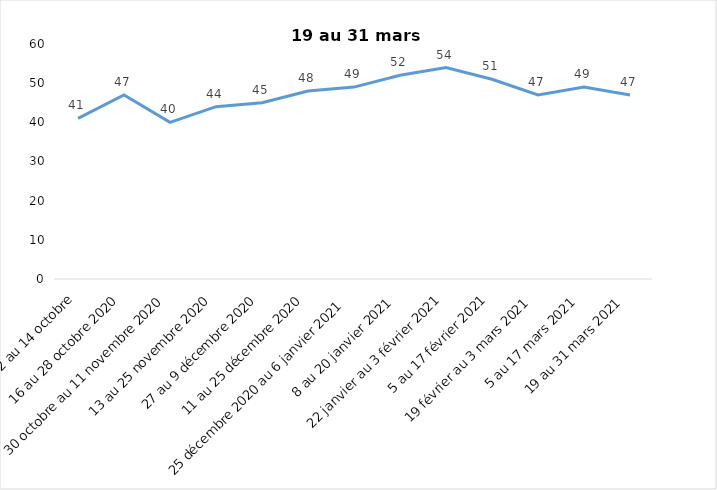
| Category | Toujours aux trois mesures |
|---|---|
| 2 au 14 octobre | 41 |
| 16 au 28 octobre 2020 | 47 |
| 30 octobre au 11 novembre 2020 | 40 |
| 13 au 25 novembre 2020 | 44 |
| 27 au 9 décembre 2020 | 45 |
| 11 au 25 décembre 2020 | 48 |
| 25 décembre 2020 au 6 janvier 2021 | 49 |
| 8 au 20 janvier 2021 | 52 |
| 22 janvier au 3 février 2021 | 54 |
| 5 au 17 février 2021 | 51 |
| 19 février au 3 mars 2021 | 47 |
| 5 au 17 mars 2021 | 49 |
| 19 au 31 mars 2021 | 47 |